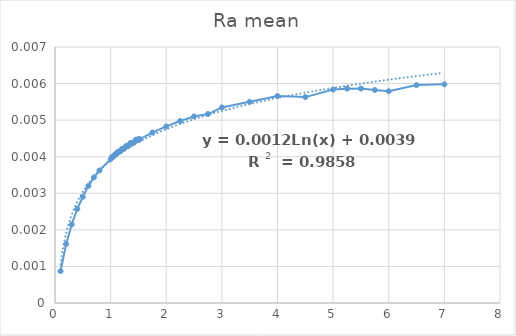
| Category | Ra mean |
|---|---|
| 0.1 | 0.001 |
| 0.2 | 0.002 |
| 0.3 | 0.002 |
| 0.4 | 0.003 |
| 0.5 | 0.003 |
| 0.6 | 0.003 |
| 0.7 | 0.003 |
| 0.8 | 0.004 |
| 1.0 | 0.004 |
| 1.025 | 0.004 |
| 1.05 | 0.004 |
| 1.075 | 0.004 |
| 1.1 | 0.004 |
| 1.125 | 0.004 |
| 1.15 | 0.004 |
| 1.175 | 0.004 |
| 1.2 | 0.004 |
| 1.225 | 0.004 |
| 1.25 | 0.004 |
| 1.275 | 0.004 |
| 1.3 | 0.004 |
| 1.325 | 0.004 |
| 1.35 | 0.004 |
| 1.375 | 0.004 |
| 1.4 | 0.004 |
| 1.425 | 0.004 |
| 1.45 | 0.004 |
| 1.465 | 0.004 |
| 1.475 | 0.004 |
| 1.48 | 0.004 |
| 1.485 | 0.004 |
| 1.495 | 0.004 |
| 1.5 | 0.004 |
| 1.505 | 0.004 |
| 1.51 | 0.004 |
| 1.515 | 0.004 |
| 1.52 | 0.004 |
| 1.525 | 0.004 |
| 1.75 | 0.005 |
| 2.0 | 0.005 |
| 2.25 | 0.005 |
| 2.5 | 0.005 |
| 2.75 | 0.005 |
| 3.0 | 0.005 |
| 3.5 | 0.006 |
| 4.0 | 0.006 |
| 4.5 | 0.006 |
| 5.0 | 0.006 |
| 5.25 | 0.006 |
| 5.5 | 0.006 |
| 5.75 | 0.006 |
| 6.0 | 0.006 |
| 6.5 | 0.006 |
| 7.0 | 0.006 |